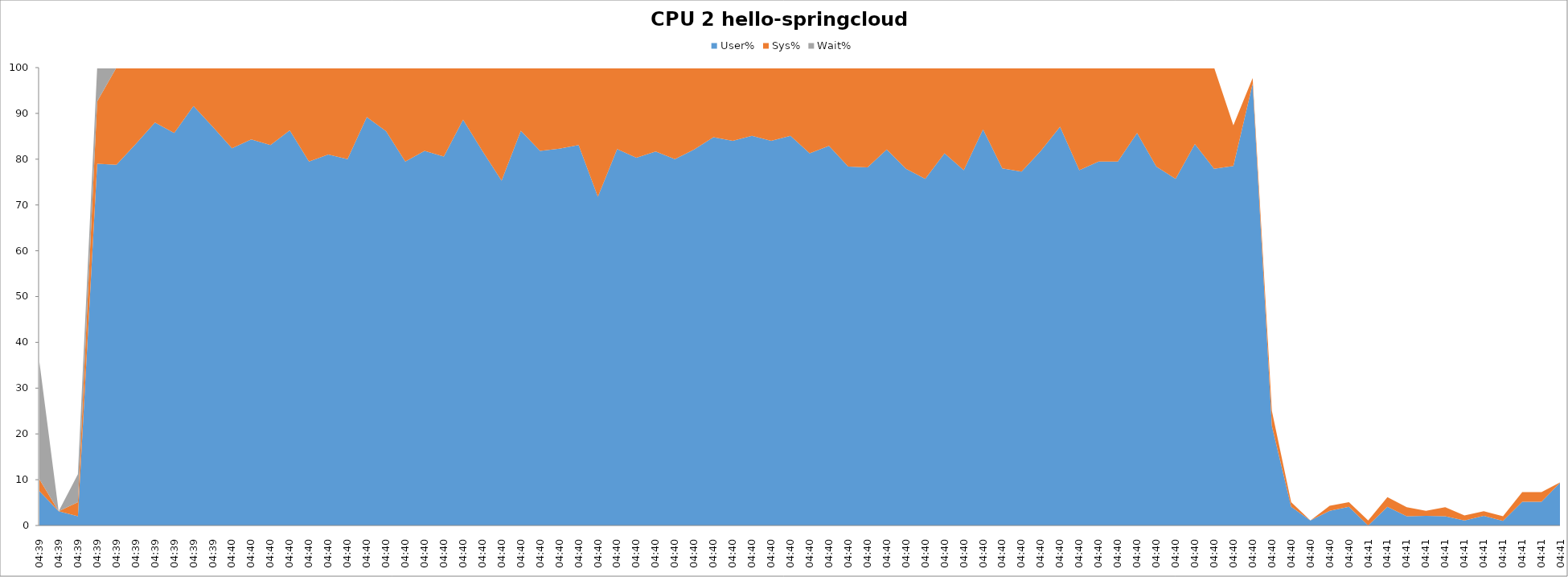
| Category | User% | Sys% | Wait% |
|---|---|---|---|
| 04:39 | 7.5 | 2.6 | 25.6 |
| 04:39 | 3.1 | 0 | 0 |
| 04:39 | 2 | 3.1 | 6.1 |
| 04:39 | 79 | 13.6 | 7.4 |
| 04:39 | 78.8 | 21.2 | 0 |
| 04:39 | 83.3 | 16.7 | 0 |
| 04:39 | 88 | 12 | 0 |
| 04:39 | 85.7 | 14.3 | 0 |
| 04:39 | 91.6 | 8.4 | 0 |
| 04:39 | 87.1 | 12.9 | 0 |
| 04:40 | 82.4 | 17.6 | 0 |
| 04:40 | 84.3 | 15.7 | 0 |
| 04:40 | 83.1 | 16.9 | 0 |
| 04:40 | 86.3 | 13.7 | 0 |
| 04:40 | 79.5 | 20.5 | 0 |
| 04:40 | 81 | 19 | 0 |
| 04:40 | 80 | 20 | 0 |
| 04:40 | 89.2 | 10.8 | 0 |
| 04:40 | 86.1 | 13.9 | 0 |
| 04:40 | 79.5 | 20.5 | 0 |
| 04:40 | 81.8 | 18.2 | 0 |
| 04:40 | 80.6 | 19.4 | 0 |
| 04:40 | 88.6 | 11.4 | 0 |
| 04:40 | 81.8 | 18.2 | 0 |
| 04:40 | 75.3 | 24.7 | 0 |
| 04:40 | 86.2 | 13.8 | 0 |
| 04:40 | 81.8 | 18.2 | 0 |
| 04:40 | 82.3 | 17.7 | 0 |
| 04:40 | 83.1 | 16.9 | 0 |
| 04:40 | 71.8 | 28.2 | 0 |
| 04:40 | 82.2 | 17.8 | 0 |
| 04:40 | 80.3 | 19.7 | 0 |
| 04:40 | 81.7 | 18.3 | 0 |
| 04:40 | 80 | 20 | 0 |
| 04:40 | 82.1 | 17.9 | 0 |
| 04:40 | 84.8 | 15.2 | 0 |
| 04:40 | 84 | 16 | 0 |
| 04:40 | 85.1 | 14.9 | 0 |
| 04:40 | 84 | 16 | 0 |
| 04:40 | 85.1 | 14.9 | 0 |
| 04:40 | 81.3 | 18.7 | 0 |
| 04:40 | 82.9 | 17.1 | 0 |
| 04:40 | 78.4 | 21.6 | 0 |
| 04:40 | 78.2 | 21.8 | 0 |
| 04:40 | 82.1 | 17.9 | 0 |
| 04:40 | 77.9 | 22.1 | 0 |
| 04:40 | 75.7 | 24.3 | 0 |
| 04:40 | 81.3 | 18.7 | 0 |
| 04:40 | 77.6 | 22.4 | 0 |
| 04:40 | 86.5 | 13.5 | 0 |
| 04:40 | 78 | 22 | 0 |
| 04:40 | 77.3 | 22.7 | 0 |
| 04:40 | 81.8 | 18.2 | 0 |
| 04:40 | 87.1 | 12.9 | 0 |
| 04:40 | 77.6 | 22.4 | 0 |
| 04:40 | 79.5 | 20.5 | 0 |
| 04:40 | 79.5 | 20.5 | 0 |
| 04:40 | 85.7 | 14.3 | 0 |
| 04:40 | 78.4 | 21.6 | 0 |
| 04:40 | 75.7 | 24.3 | 0 |
| 04:40 | 83.3 | 16.7 | 0 |
| 04:40 | 77.9 | 22.1 | 0 |
| 04:40 | 78.5 | 8.9 | 0 |
| 04:40 | 96.5 | 1.2 | 0 |
| 04:40 | 21.7 | 3.3 | 0 |
| 04:40 | 4.1 | 1 | 0 |
| 04:40 | 1.1 | 0 | 0 |
| 04:40 | 3.2 | 1.1 | 0 |
| 04:40 | 4.1 | 1 | 0 |
| 04:41 | 0 | 1.1 | 0 |
| 04:41 | 4.1 | 2.1 | 0 |
| 04:41 | 2 | 2 | 0 |
| 04:41 | 2.1 | 1.1 | 0 |
| 04:41 | 2 | 2 | 0 |
| 04:41 | 1.1 | 1.1 | 0 |
| 04:41 | 2.1 | 1 | 0 |
| 04:41 | 1 | 1 | 0 |
| 04:41 | 5.2 | 2.1 | 0 |
| 04:41 | 5.2 | 2.1 | 0 |
| 04:41 | 9.5 | 0 | 0 |